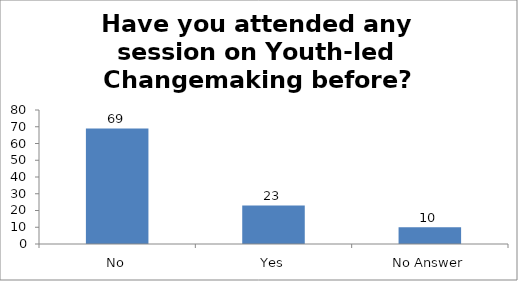
| Category | Have you attended any session on Youth-led Changemaking before? |
|---|---|
| No | 69 |
| Yes | 23 |
| No Answer | 10 |